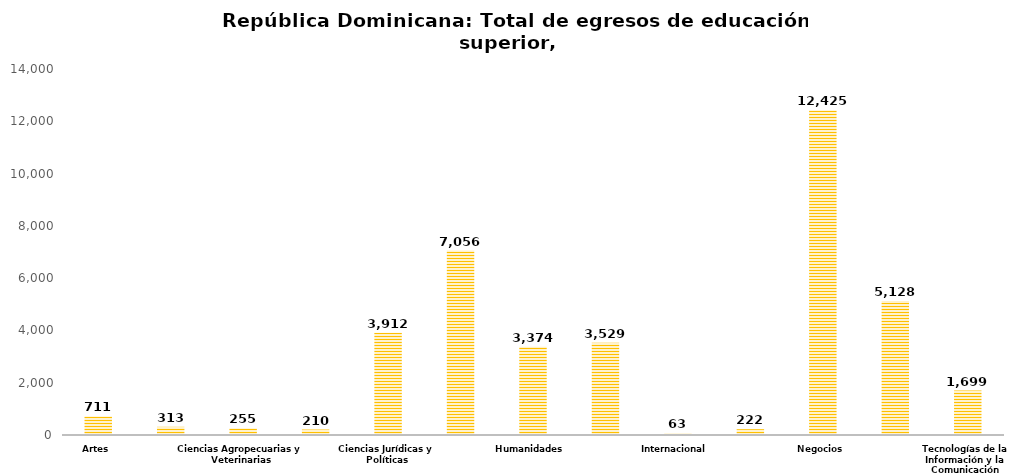
| Category | Series 0 |
|---|---|
| Artes | 711 |
| Ciencias | 313 |
| Ciencias Agropecuarias y Veterinarias | 255 |
| Ciencias Económicas y Sociales | 210 |
| Ciencias Jurídicas y Políticas | 3912 |
| Educación | 7056 |
| Humanidades | 3374 |
| Ingeniería y Arquitectura | 3529 |
| Internacional | 63 |
| Militar | 222 |
| Negocios | 12425 |
| Salud | 5128 |
| Tecnologías de la Información y la Comunicación | 1699 |